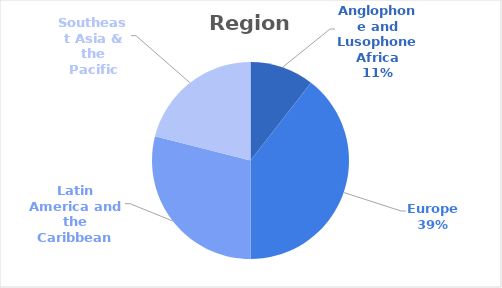
| Category | Series 0 |
|---|---|
| Anglophone and Lusophone Africa | 4 |
| Europe | 15 |
| Latin America and the Caribbean | 11 |
| Southeast Asia & the Pacific | 8 |